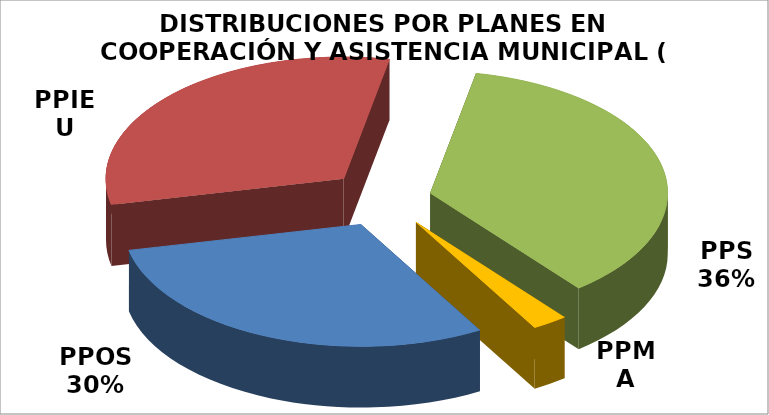
| Category | Series 0 |
|---|---|
| PPOS | 7685000 |
| PPIEU | 8088840.42 |
| PPS | 9288247.07 |
| PPMA | 620673.32 |